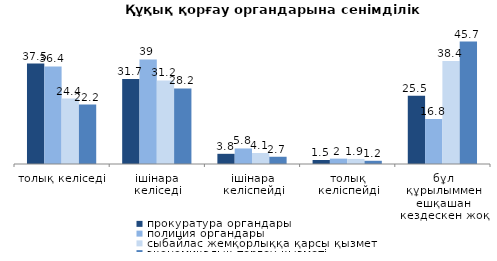
| Category | прокуратура органдары | полиция органдары | сыбайлас жемқорлыққа қарсы қызмет | экономикалық тергеу қызметі |
|---|---|---|---|---|
| толық келіседі | 37.5 | 36.4 | 24.4 | 22.2 |
| ішінара келіседі | 31.7 | 39 | 31.2 | 28.2 |
| ішінара келіспейді | 3.8 | 5.8 | 4.1 | 2.7 |
| толық келіспейді | 1.5 | 2 | 1.9 | 1.2 |
| бұл құрылыммен ешқашан кездескен жоқ | 25.5 | 16.8 | 38.4 | 45.7 |